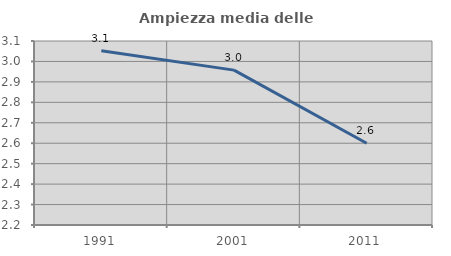
| Category | Ampiezza media delle famiglie |
|---|---|
| 1991.0 | 3.052 |
| 2001.0 | 2.958 |
| 2011.0 | 2.6 |